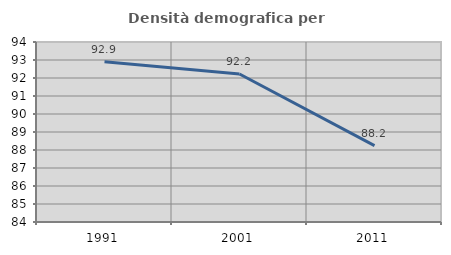
| Category | Densità demografica |
|---|---|
| 1991.0 | 92.902 |
| 2001.0 | 92.223 |
| 2011.0 | 88.247 |